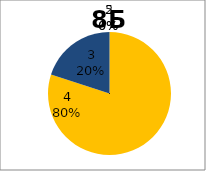
| Category | Series 0 |
|---|---|
| 5.0 | 0 |
| 4.0 | 8 |
| 3.0 | 2 |
| 2.0 | 0 |